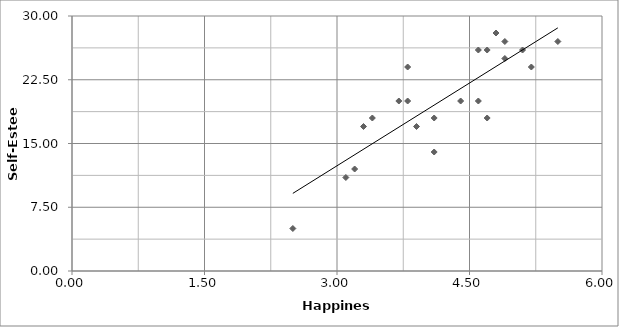
| Category | Self-Esteem |
|---|---|
| 3.4 | 18 |
| 4.9 | 27 |
| 3.9 | 17 |
| 3.1 | 11 |
| 4.4 | 20 |
| 4.1 | 18 |
| 2.5 | 5 |
| 4.7 | 26 |
| 3.8 | 20 |
| 3.2 | 12 |
| 5.2 | 24 |
| 4.6 | 26 |
| 3.7 | 20 |
| 3.3 | 17 |
| 5.1 | 26 |
| 4.1 | 14 |
| 4.9 | 25 |
| 4.8 | 28 |
| 4.6 | 20 |
| 3.8 | 24 |
| 5.5 | 27 |
| 4.7 | 18 |